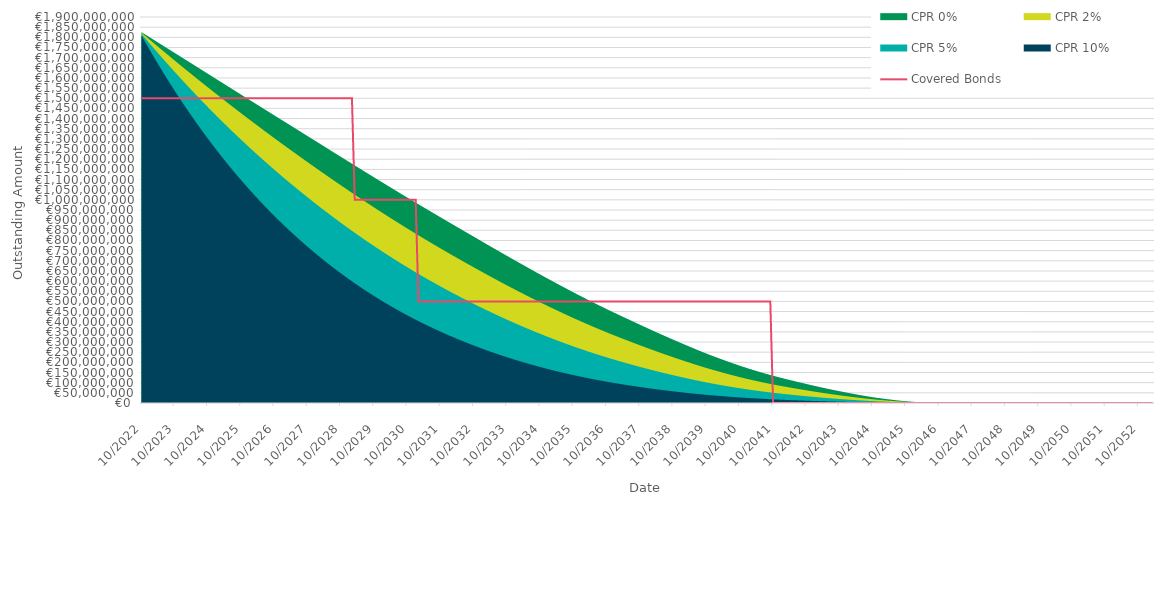
| Category | Covered Bonds |
|---|---|
| 2022-10-31 | 1500000000 |
| 2022-11-30 | 1500000000 |
| 2022-12-31 | 1500000000 |
| 2023-01-31 | 1500000000 |
| 2023-02-28 | 1500000000 |
| 2023-03-31 | 1500000000 |
| 2023-04-30 | 1500000000 |
| 2023-05-31 | 1500000000 |
| 2023-06-30 | 1500000000 |
| 2023-07-31 | 1500000000 |
| 2023-08-31 | 1500000000 |
| 2023-09-30 | 1500000000 |
| 2023-10-31 | 1500000000 |
| 2023-11-30 | 1500000000 |
| 2023-12-31 | 1500000000 |
| 2024-01-31 | 1500000000 |
| 2024-02-29 | 1500000000 |
| 2024-03-31 | 1500000000 |
| 2024-04-30 | 1500000000 |
| 2024-05-31 | 1500000000 |
| 2024-06-30 | 1500000000 |
| 2024-07-31 | 1500000000 |
| 2024-08-31 | 1500000000 |
| 2024-09-30 | 1500000000 |
| 2024-10-31 | 1500000000 |
| 2024-11-30 | 1500000000 |
| 2024-12-31 | 1500000000 |
| 2025-01-31 | 1500000000 |
| 2025-02-28 | 1500000000 |
| 2025-03-31 | 1500000000 |
| 2025-04-30 | 1500000000 |
| 2025-05-31 | 1500000000 |
| 2025-06-30 | 1500000000 |
| 2025-07-31 | 1500000000 |
| 2025-08-31 | 1500000000 |
| 2025-09-30 | 1500000000 |
| 2025-10-31 | 1500000000 |
| 2025-11-30 | 1500000000 |
| 2025-12-31 | 1500000000 |
| 2026-01-31 | 1500000000 |
| 2026-02-28 | 1500000000 |
| 2026-03-31 | 1500000000 |
| 2026-04-30 | 1500000000 |
| 2026-05-31 | 1500000000 |
| 2026-06-30 | 1500000000 |
| 2026-07-31 | 1500000000 |
| 2026-08-31 | 1500000000 |
| 2026-09-30 | 1500000000 |
| 2026-10-31 | 1500000000 |
| 2026-11-30 | 1500000000 |
| 2026-12-31 | 1500000000 |
| 2027-01-31 | 1500000000 |
| 2027-02-28 | 1500000000 |
| 2027-03-31 | 1500000000 |
| 2027-04-30 | 1500000000 |
| 2027-05-31 | 1500000000 |
| 2027-06-30 | 1500000000 |
| 2027-07-31 | 1500000000 |
| 2027-08-31 | 1500000000 |
| 2027-09-30 | 1500000000 |
| 2027-10-31 | 1500000000 |
| 2027-11-30 | 1500000000 |
| 2027-12-31 | 1500000000 |
| 2028-01-31 | 1500000000 |
| 2028-02-29 | 1500000000 |
| 2028-03-31 | 1500000000 |
| 2028-04-30 | 1500000000 |
| 2028-05-31 | 1500000000 |
| 2028-06-30 | 1500000000 |
| 2028-07-31 | 1500000000 |
| 2028-08-31 | 1500000000 |
| 2028-09-30 | 1500000000 |
| 2028-10-31 | 1500000000 |
| 2028-11-30 | 1500000000 |
| 2028-12-31 | 1500000000 |
| 2029-01-31 | 1500000000 |
| 2029-02-28 | 1500000000 |
| 2029-03-31 | 1000000000 |
| 2029-04-30 | 1000000000 |
| 2029-05-31 | 1000000000 |
| 2029-06-30 | 1000000000 |
| 2029-07-31 | 1000000000 |
| 2029-08-31 | 1000000000 |
| 2029-09-30 | 1000000000 |
| 2029-10-31 | 1000000000 |
| 2029-11-30 | 1000000000 |
| 2029-12-31 | 1000000000 |
| 2030-01-31 | 1000000000 |
| 2030-02-28 | 1000000000 |
| 2030-03-31 | 1000000000 |
| 2030-04-30 | 1000000000 |
| 2030-05-31 | 1000000000 |
| 2030-06-30 | 1000000000 |
| 2030-07-31 | 1000000000 |
| 2030-08-31 | 1000000000 |
| 2030-09-30 | 1000000000 |
| 2030-10-31 | 1000000000 |
| 2030-11-30 | 1000000000 |
| 2030-12-31 | 1000000000 |
| 2031-01-31 | 1000000000 |
| 2031-02-28 | 500000000 |
| 2031-03-31 | 500000000 |
| 2031-04-30 | 500000000 |
| 2031-05-31 | 500000000 |
| 2031-06-30 | 500000000 |
| 2031-07-31 | 500000000 |
| 2031-08-31 | 500000000 |
| 2031-09-30 | 500000000 |
| 2031-10-31 | 500000000 |
| 2031-11-30 | 500000000 |
| 2031-12-31 | 500000000 |
| 2032-01-31 | 500000000 |
| 2032-02-29 | 500000000 |
| 2032-03-31 | 500000000 |
| 2032-04-30 | 500000000 |
| 2032-05-31 | 500000000 |
| 2032-06-30 | 500000000 |
| 2032-07-31 | 500000000 |
| 2032-08-31 | 500000000 |
| 2032-09-30 | 500000000 |
| 2032-10-31 | 500000000 |
| 2032-11-30 | 500000000 |
| 2032-12-31 | 500000000 |
| 2033-01-31 | 500000000 |
| 2033-02-28 | 500000000 |
| 2033-03-31 | 500000000 |
| 2033-04-30 | 500000000 |
| 2033-05-31 | 500000000 |
| 2033-06-30 | 500000000 |
| 2033-07-31 | 500000000 |
| 2033-08-31 | 500000000 |
| 2033-09-30 | 500000000 |
| 2033-10-31 | 500000000 |
| 2033-11-30 | 500000000 |
| 2033-12-31 | 500000000 |
| 2034-01-31 | 500000000 |
| 2034-02-28 | 500000000 |
| 2034-03-31 | 500000000 |
| 2034-04-30 | 500000000 |
| 2034-05-31 | 500000000 |
| 2034-06-30 | 500000000 |
| 2034-07-31 | 500000000 |
| 2034-08-31 | 500000000 |
| 2034-09-30 | 500000000 |
| 2034-10-31 | 500000000 |
| 2034-11-30 | 500000000 |
| 2034-12-31 | 500000000 |
| 2035-01-31 | 500000000 |
| 2035-02-28 | 500000000 |
| 2035-03-31 | 500000000 |
| 2035-04-30 | 500000000 |
| 2035-05-31 | 500000000 |
| 2035-06-30 | 500000000 |
| 2035-07-31 | 500000000 |
| 2035-08-31 | 500000000 |
| 2035-09-30 | 500000000 |
| 2035-10-31 | 500000000 |
| 2035-11-30 | 500000000 |
| 2035-12-31 | 500000000 |
| 2036-01-31 | 500000000 |
| 2036-02-29 | 500000000 |
| 2036-03-31 | 500000000 |
| 2036-04-30 | 500000000 |
| 2036-05-31 | 500000000 |
| 2036-06-30 | 500000000 |
| 2036-07-31 | 500000000 |
| 2036-08-31 | 500000000 |
| 2036-09-30 | 500000000 |
| 2036-10-31 | 500000000 |
| 2036-11-30 | 500000000 |
| 2036-12-31 | 500000000 |
| 2037-01-31 | 500000000 |
| 2037-02-28 | 500000000 |
| 2037-03-31 | 500000000 |
| 2037-04-30 | 500000000 |
| 2037-05-31 | 500000000 |
| 2037-06-30 | 500000000 |
| 2037-07-31 | 500000000 |
| 2037-08-31 | 500000000 |
| 2037-09-30 | 500000000 |
| 2037-10-31 | 500000000 |
| 2037-11-30 | 500000000 |
| 2037-12-31 | 500000000 |
| 2038-01-31 | 500000000 |
| 2038-02-28 | 500000000 |
| 2038-03-31 | 500000000 |
| 2038-04-30 | 500000000 |
| 2038-05-31 | 500000000 |
| 2038-06-30 | 500000000 |
| 2038-07-31 | 500000000 |
| 2038-08-31 | 500000000 |
| 2038-09-30 | 500000000 |
| 2038-10-31 | 500000000 |
| 2038-11-30 | 500000000 |
| 2038-12-31 | 500000000 |
| 2039-01-31 | 500000000 |
| 2039-02-28 | 500000000 |
| 2039-03-31 | 500000000 |
| 2039-04-30 | 500000000 |
| 2039-05-31 | 500000000 |
| 2039-06-30 | 500000000 |
| 2039-07-31 | 500000000 |
| 2039-08-31 | 500000000 |
| 2039-09-30 | 500000000 |
| 2039-10-31 | 500000000 |
| 2039-11-30 | 500000000 |
| 2039-12-31 | 500000000 |
| 2040-01-31 | 500000000 |
| 2040-02-29 | 500000000 |
| 2040-03-31 | 500000000 |
| 2040-04-30 | 500000000 |
| 2040-05-31 | 500000000 |
| 2040-06-30 | 500000000 |
| 2040-07-31 | 500000000 |
| 2040-08-31 | 500000000 |
| 2040-09-30 | 500000000 |
| 2040-10-31 | 500000000 |
| 2040-11-30 | 500000000 |
| 2040-12-31 | 500000000 |
| 2041-01-31 | 500000000 |
| 2041-02-28 | 500000000 |
| 2041-03-31 | 500000000 |
| 2041-04-30 | 500000000 |
| 2041-05-31 | 500000000 |
| 2041-06-30 | 500000000 |
| 2041-07-31 | 500000000 |
| 2041-08-31 | 500000000 |
| 2041-09-30 | 500000000 |
| 2041-10-31 | 0 |
| 2041-11-30 | 0 |
| 2041-12-31 | 0 |
| 2042-01-31 | 0 |
| 2042-02-28 | 0 |
| 2042-03-31 | 0 |
| 2042-04-30 | 0 |
| 2042-05-31 | 0 |
| 2042-06-30 | 0 |
| 2042-07-31 | 0 |
| 2042-08-31 | 0 |
| 2042-09-30 | 0 |
| 2042-10-31 | 0 |
| 2042-11-30 | 0 |
| 2042-12-31 | 0 |
| 2043-01-31 | 0 |
| 2043-02-28 | 0 |
| 2043-03-31 | 0 |
| 2043-04-30 | 0 |
| 2043-05-31 | 0 |
| 2043-06-30 | 0 |
| 2043-07-31 | 0 |
| 2043-08-31 | 0 |
| 2043-09-30 | 0 |
| 2043-10-31 | 0 |
| 2043-11-30 | 0 |
| 2043-12-31 | 0 |
| 2044-01-31 | 0 |
| 2044-02-29 | 0 |
| 2044-03-31 | 0 |
| 2044-04-30 | 0 |
| 2044-05-31 | 0 |
| 2044-06-30 | 0 |
| 2044-07-31 | 0 |
| 2044-08-31 | 0 |
| 2044-09-30 | 0 |
| 2044-10-31 | 0 |
| 2044-11-30 | 0 |
| 2044-12-31 | 0 |
| 2045-01-31 | 0 |
| 2045-02-28 | 0 |
| 2045-03-31 | 0 |
| 2045-04-30 | 0 |
| 2045-05-31 | 0 |
| 2045-06-30 | 0 |
| 2045-07-31 | 0 |
| 2045-08-31 | 0 |
| 2045-09-30 | 0 |
| 2045-10-31 | 0 |
| 2045-11-30 | 0 |
| 2045-12-31 | 0 |
| 2046-01-31 | 0 |
| 2046-02-28 | 0 |
| 2046-03-31 | 0 |
| 2046-04-30 | 0 |
| 2046-05-31 | 0 |
| 2046-06-30 | 0 |
| 2046-07-31 | 0 |
| 2046-08-31 | 0 |
| 2046-09-30 | 0 |
| 2046-10-31 | 0 |
| 2046-11-30 | 0 |
| 2046-12-31 | 0 |
| 2047-01-31 | 0 |
| 2047-02-28 | 0 |
| 2047-03-31 | 0 |
| 2047-04-30 | 0 |
| 2047-05-31 | 0 |
| 2047-06-30 | 0 |
| 2047-07-31 | 0 |
| 2047-08-31 | 0 |
| 2047-09-30 | 0 |
| 2047-10-31 | 0 |
| 2047-11-30 | 0 |
| 2047-12-31 | 0 |
| 2048-01-31 | 0 |
| 2048-02-29 | 0 |
| 2048-03-31 | 0 |
| 2048-04-30 | 0 |
| 2048-05-31 | 0 |
| 2048-06-30 | 0 |
| 2048-07-31 | 0 |
| 2048-08-31 | 0 |
| 2048-09-30 | 0 |
| 2048-10-31 | 0 |
| 2048-11-30 | 0 |
| 2048-12-31 | 0 |
| 2049-01-31 | 0 |
| 2049-02-28 | 0 |
| 2049-03-31 | 0 |
| 2049-04-30 | 0 |
| 2049-05-31 | 0 |
| 2049-06-30 | 0 |
| 2049-07-31 | 0 |
| 2049-08-31 | 0 |
| 2049-09-30 | 0 |
| 2049-10-31 | 0 |
| 2049-11-30 | 0 |
| 2049-12-31 | 0 |
| 2050-01-31 | 0 |
| 2050-02-28 | 0 |
| 2050-03-31 | 0 |
| 2050-04-30 | 0 |
| 2050-05-31 | 0 |
| 2050-06-30 | 0 |
| 2050-07-31 | 0 |
| 2050-08-31 | 0 |
| 2050-09-30 | 0 |
| 2050-10-31 | 0 |
| 2050-11-30 | 0 |
| 2050-12-31 | 0 |
| 2051-01-31 | 0 |
| 2051-02-28 | 0 |
| 2051-03-31 | 0 |
| 2051-04-30 | 0 |
| 2051-05-31 | 0 |
| 2051-06-30 | 0 |
| 2051-07-31 | 0 |
| 2051-08-31 | 0 |
| 2051-09-30 | 0 |
| 2051-10-31 | 0 |
| 2051-11-30 | 0 |
| 2051-12-31 | 0 |
| 2052-01-31 | 0 |
| 2052-02-29 | 0 |
| 2052-03-31 | 0 |
| 2052-04-30 | 0 |
| 2052-05-31 | 0 |
| 2052-06-30 | 0 |
| 2052-07-31 | 0 |
| 2052-08-31 | 0 |
| 2052-09-30 | 0 |
| 2052-10-31 | 0 |
| 2052-11-30 | 0 |
| 2052-12-31 | 0 |
| 2053-01-31 | 0 |
| 2053-02-28 | 0 |
| 2053-03-31 | 0 |